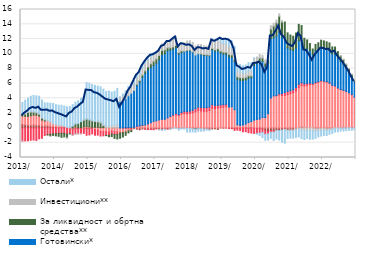
| Category | По трансакционим рачунима | Стамбени | Потрошачки | Готовински* | За ликвидност и обртна средства** | Инвестициони** | Остали* |
|---|---|---|---|---|---|---|---|
| 2013-01-01 | 0.492 | 1.111 | -1.776 | 0 | 0.228 | -0.026 | 1.61 |
| 2013-02-01 | 0.439 | 1.127 | -1.758 | 0 | 0.325 | 0.055 | 1.802 |
| 2013-03-01 | 0.384 | 1.163 | -1.741 | 0 | 0.545 | 0.165 | 1.739 |
| 2013-04-01 | 0.352 | 1.289 | -1.665 | 0 | 0.493 | 0.147 | 1.999 |
| 2013-05-01 | 0.415 | 1.308 | -1.636 | 0 | 0.394 | 0.108 | 2.173 |
| 2013-06-01 | 0.343 | 1.366 | -1.699 | 0 | 0.33 | 0.062 | 2.234 |
| 2013-07-01 | 0.366 | 1.236 | -1.48 | 0 | 0.258 | 0.044 | 2.377 |
| 2013-08-01 | 0.269 | 0.793 | -1.401 | 0 | 0.249 | 0.096 | 2.37 |
| 2013-09-01 | 0.275 | 0.649 | -1.02 | 0 | 0.155 | 0.104 | 2.206 |
| 2013-10-01 | 0.288 | 0.658 | -0.915 | 0 | -0.041 | 0.071 | 2.362 |
| 2013-11-01 | 0.228 | 0.543 | -0.865 | 0 | -0.219 | 0.056 | 2.504 |
| 2013-12-01 | 0.173 | 0.348 | -0.812 | 0 | -0.202 | 0.099 | 2.679 |
| 2014-01-01 | 0.157 | 0.254 | -0.797 | 0 | -0.28 | 0.097 | 2.635 |
| 2014-02-01 | 0.046 | 0.245 | -0.762 | 0 | -0.373 | 0.085 | 2.693 |
| 2014-03-01 | 0.09 | 0.216 | -0.715 | 0 | -0.554 | 0.005 | 2.756 |
| 2014-04-01 | 0.083 | 0.103 | -0.741 | 0 | -0.539 | -0.021 | 2.769 |
| 2014-05-01 | -0.101 | 0.074 | -0.749 | 0 | -0.489 | -0.025 | 2.775 |
| 2014-06-01 | 0.019 | -0.042 | -0.742 | 0 | -0.097 | -0.013 | 2.845 |
| 2014-07-01 | -0.097 | -0.133 | -0.742 | 0 | 0.233 | -0.038 | 2.909 |
| 2014-08-01 | -0.096 | 0.125 | -0.721 | 0 | 0.406 | -0.038 | 2.94 |
| 2014-09-01 | -0.079 | 0.01 | -0.703 | 0 | 0.582 | -0.06 | 3.072 |
| 2014-10-01 | -0.145 | 0.049 | -0.645 | 0 | 0.801 | -0.027 | 3.138 |
| 2014-11-01 | -0.136 | 0.135 | -0.613 | 0 | 0.927 | 0.032 | 3.103 |
| 2014-12-01 | -0.093 | 0.165 | -0.899 | 0 | 1.027 | 0.018 | 4.9 |
| 2015-01-01 | -0.101 | 0.127 | -0.85 | 0 | 0.953 | 0.027 | 4.917 |
| 2015-02-01 | 0.048 | 0.049 | -0.809 | 0 | 0.87 | 0.009 | 4.873 |
| 2015-03-01 | 0.077 | -0.228 | -0.764 | 0 | 0.805 | 0.041 | 4.823 |
| 2015-04-01 | 0.094 | -0.3 | -0.676 | 0 | 0.722 | 0.107 | 4.729 |
| 2015-05-01 | 0.036 | -0.497 | -0.601 | 0 | 0.653 | 0.15 | 4.713 |
| 2015-06-01 | 0.047 | -0.529 | -0.544 | 0 | 0.27 | 0.209 | 4.71 |
| 2015-07-01 | 0.01 | -0.526 | -0.494 | 0 | -0.027 | 0.249 | 4.661 |
| 2015-08-01 | 0.058 | -0.546 | -0.455 | 0 | -0.197 | 0.245 | 4.67 |
| 2015-09-01 | -0.026 | -0.398 | -0.4 | 0 | -0.348 | 0.31 | 4.533 |
| 2015-10-01 | -0.033 | -0.489 | -0.371 | 0 | -0.523 | 0.396 | 4.552 |
| 2015-11-01 | 0.007 | -0.534 | -0.343 | 0 | -0.612 | 0.475 | 4.866 |
| 2015-12-01 | -0.087 | -0.586 | -0.019 | 3.553 | -0.71 | 0.612 | 0.012 |
| 2016-01-01 | -0.124 | -0.493 | -0.015 | 3.681 | -0.603 | 0.661 | 0.247 |
| 2016-02-01 | -0.042 | -0.508 | 0.006 | 3.928 | -0.452 | 0.725 | 0.36 |
| 2016-03-01 | -0.149 | -0.229 | 0.045 | 4.286 | -0.298 | 0.871 | 0.42 |
| 2016-04-01 | -0.285 | -0.1 | 0.053 | 4.618 | -0.122 | 0.89 | 0.421 |
| 2016-05-01 | -0.106 | 0.028 | 0.062 | 4.946 | 0.026 | 0.927 | 0.414 |
| 2016-06-01 | -0.172 | 0.16 | 0.059 | 5.547 | 0.131 | 0.935 | 0.426 |
| 2016-07-01 | -0.251 | 0.241 | 0.034 | 5.91 | 0.23 | 0.921 | 0.395 |
| 2016-08-01 | -0.151 | 0.345 | 0.008 | 6.5 | 0.297 | 0.931 | 0.417 |
| 2016-09-01 | -0.175 | 0.406 | -0.015 | 6.972 | 0.338 | 1.003 | 0.388 |
| 2016-10-01 | -0.173 | 0.538 | -0.05 | 7.327 | 0.384 | 0.98 | 0.406 |
| 2016-11-01 | -0.171 | 0.696 | -0.06 | 7.474 | 0.486 | 0.944 | 0.426 |
| 2016-12-01 | -0.197 | 0.873 | -0.04 | 7.552 | 0.582 | 0.863 | 0.252 |
| 2017-01-01 | -0.104 | 0.959 | -0.02 | 7.784 | 0.581 | 0.848 | 0.045 |
| 2017-02-01 | -0.204 | 1.081 | -0.026 | 8.139 | 0.571 | 0.839 | -0.036 |
| 2017-03-01 | -0.204 | 1.159 | -0.038 | 8.749 | 0.574 | 0.871 | -0.092 |
| 2017-04-01 | -0.15 | 1.157 | -0.034 | 8.89 | 0.496 | 0.901 | -0.106 |
| 2017-05-01 | -0.136 | 1.349 | -0.007 | 9.092 | 0.39 | 0.953 | 0.027 |
| 2017-06-01 | -0.147 | 1.539 | 0.027 | 8.949 | 0.32 | 1.052 | -0.078 |
| 2017-07-01 | -0.013 | 1.668 | 0.095 | 8.902 | 0.277 | 1.122 | -0.053 |
| 2017-08-01 | -0.025 | 1.767 | 0.186 | 8.894 | 0.31 | 1.206 | -0.055 |
| 2017-09-01 | -0.094 | 1.647 | 0.143 | 8.192 | 0.201 | 1.092 | -0.235 |
| 2017-10-01 | -0.014 | 1.85 | 0.235 | 8.093 | 0.233 | 1.132 | -0.151 |
| 2017-11-01 | -0.023 | 1.939 | 0.299 | 8.08 | 0.04 | 1.128 | -0.15 |
| 2017-12-01 | -0.055 | 1.895 | 0.307 | 8.215 | 0.084 | 1.227 | -0.507 |
| 2018-01-01 | -0.08 | 1.954 | 0.323 | 8.187 | 0.077 | 1.244 | -0.481 |
| 2018-02-01 | -0.112 | 2.022 | 0.364 | 7.858 | 0.041 | 1.267 | -0.424 |
| 2018-03-01 | -0.109 | 2.181 | 0.41 | 7.241 | -0.039 | 1.218 | -0.434 |
| 2018-04-01 | -0.08 | 2.337 | 0.457 | 7.237 | -0.009 | 1.25 | -0.36 |
| 2018-05-01 | -0.114 | 2.292 | 0.485 | 7.16 | 0.07 | 1.248 | -0.331 |
| 2018-06-01 | -0.164 | 2.242 | 0.499 | 7.054 | 0.135 | 1.17 | -0.265 |
| 2018-07-01 | -0.143 | 2.256 | 0.489 | 7.02 | 0.116 | 1.173 | -0.183 |
| 2018-08-01 | -0.223 | 2.357 | 0.468 | 6.916 | 0.085 | 1.152 | -0.143 |
| 2018-09-01 | -0.139 | 2.658 | 0.492 | 7.41 | 0.196 | 1.199 | 0.065 |
| 2018-10-01 | -0.124 | 2.593 | 0.436 | 7.379 | 0.15 | 1.167 | 0.099 |
| 2018-11-01 | -0.204 | 2.68 | 0.38 | 7.342 | 0.298 | 1.219 | 0.158 |
| 2018-12-01 | -0.005 | 2.736 | 0.362 | 7.027 | 0.25 | 1.199 | 0.551 |
| 2019-01-01 | -0.044 | 2.807 | 0.339 | 6.833 | 0.26 | 1.161 | 0.586 |
| 2019-02-01 | -0.024 | 2.911 | 0.28 | 6.76 | 0.267 | 1.154 | 0.65 |
| 2019-03-01 | -0.041 | 2.81 | -0.018 | 6.848 | 0.276 | 1.125 | 0.899 |
| 2019-04-01 | -0.041 | 2.851 | -0.072 | 6.67 | 0.344 | 0.939 | 0.934 |
| 2019-05-01 | -0.1 | 2.468 | -0.228 | 6.479 | 0.327 | 0.833 | 0.908 |
| 2019-06-01 | -0.031 | 0.418 | -0.277 | 6.176 | 0.319 | 0.797 | 0.985 |
| 2019-07-01 | -0.025 | 0.329 | -0.339 | 6.12 | 0.361 | 0.703 | 1.051 |
| 2019-08-01 | -0.025 | 0.403 | -0.498 | 5.998 | 0.374 | 0.626 | 1.011 |
| 2019-09-01 | 0.002 | 0.505 | -0.508 | 6.006 | 0.326 | 0.599 | 1.06 |
| 2019-10-01 | -0.05 | 0.732 | -0.599 | 5.959 | 0.37 | 0.626 | 1.125 |
| 2019-11-01 | 0.007 | 0.833 | -0.705 | 5.97 | 0.215 | 0.673 | 1.082 |
| 2019-12-01 | -0.045 | 1.054 | -0.703 | 7.412 | 0.299 | 0.593 | 0.108 |
| 2020-01-31 | -0.066 | 1.137 | -0.68 | 7.552 | 0.352 | 0.533 | -0.107 |
| 2020-02-29 | -0.05 | 1.19 | -0.645 | 7.832 | 0.424 | 0.471 | -0.342 |
| 2020-03-31 | -0.142 | 1.412 | -0.468 | 7.55 | 0.49 | 0.355 | -0.69 |
| 2020-04-30 | -0.389 | 1.394 | -0.481 | 6.938 | 0.422 | 0.421 | -0.803 |
| 2020-05-31 | -0.495 | 1.906 | -0.315 | 6.799 | 0.629 | 0.444 | -0.833 |
| 2020-06-30 | -0.37 | 4.031 | -0.214 | 8.026 | 1.3 | 0.469 | -0.818 |
| 2020-07-31 | -0.414 | 4.316 | -0.138 | 7.868 | 1.575 | 0.386 | -1.15 |
| 2020-08-31 | -0.351 | 4.33 | 0.051 | 8.037 | 1.786 | 0.363 | -1.144 |
| 2020-09-30 | -0.365 | 4.448 | 0.173 | 8.326 | 2.142 | 0.325 | -1.281 |
| 2020-10-31 | -0.294 | 4.368 | 0.267 | 7.647 | 2.039 | 0.188 | -1.635 |
| 2020-11-30 | -0.236 | 4.392 | 0.386 | 7.401 | 2.127 | -0.011 | -1.82 |
| 2020-12-31 | -0.302 | 4.507 | 0.414 | 5.891 | 2.034 | -0.043 | -1.082 |
| 2021-01-31 | -0.282 | 4.635 | 0.397 | 5.556 | 1.97 | -0.052 | -1.049 |
| 2021-02-28 | -0.276 | 4.761 | 0.394 | 5.304 | 1.925 | -0.108 | -0.997 |
| 2021-03-31 | -0.145 | 5.005 | 0.432 | 5.347 | 2.033 | -0.133 | -1.003 |
| 2021-04-30 | 0.02 | 5.429 | 0.452 | 5.88 | 2.211 | -0.185 | -1.049 |
| 2021-05-31 | 0.142 | 5.576 | 0.389 | 5.716 | 2.006 | -0.317 | -1.137 |
| 2021-06-30 | 0.036 | 5.628 | 0.3 | 4.693 | 1.452 | -0.375 | -1.203 |
| 2021-07-31 | 0.04 | 5.703 | 0.271 | 4.689 | 1.181 | -0.351 | -1.075 |
| 2021-08-31 | 0.059 | 5.81 | 0.205 | 4.34 | 0.98 | -0.415 | -1.12 |
| 2021-09-30 | 0 | 5.853 | 0.128 | 3.917 | 0.762 | -0.412 | -1.106 |
| 2021-10-31 | -0.107 | 6.042 | 0.11 | 4.261 | 0.87 | -0.332 | -0.987 |
| 2021-11-30 | -0.109 | 6.166 | 0.093 | 4.251 | 0.994 | -0.266 | -0.839 |
| 2021-12-31 | -0.087 | 6.322 | 0.08 | 4.403 | 1.047 | -0.273 | -0.742 |
| 2022-01-31 | -0.066 | 6.231 | 0.084 | 4.443 | 1.001 | -0.255 | -0.693 |
| 2022-02-28 | -0.124 | 6.188 | 0.071 | 4.378 | 0.993 | -0.225 | -0.687 |
| 2022-03-31 | -0.083 | 6.019 | 0.055 | 4.389 | 1.023 | -0.188 | -0.585 |
| 2022-04-30 | -0.061 | 5.737 | 0.032 | 4.238 | 0.934 | -0.139 | -0.549 |
| 2022-05-31 | 0.017 | 5.644 | 0.02 | 4.3 | 0.95 | -0.069 | -0.489 |
| 2022-06-30 | 0.008 | 5.383 | 0.015 | 4.074 | 0.832 | -0.056 | -0.481 |
| 2022-07-31 | -0.011 | 5.185 | 0.011 | 3.782 | 0.741 | 0.009 | -0.429 |
| 2022-08-31 | -0.029 | 5.065 | 0.012 | 3.513 | 0.637 | 0.065 | -0.393 |
| 2022-09-30 | -0.009 | 4.898 | 0.018 | 3.181 | 0.488 | 0.078 | -0.369 |
| 2022-10-31 | 0.065 | 4.653 | 0.028 | 2.867 | 0.387 | 0.039 | -0.323 |
| 2022-11-30 | 0.074 | 4.406 | 0.043 | 2.439 | 0.259 | 0.049 | -0.305 |
| 2022-12-31 | 0.034 | 4.091 | 0.046 | 2.1 | 0.164 | 0.136 | -0.311 |